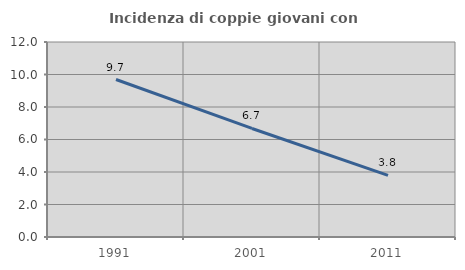
| Category | Incidenza di coppie giovani con figli |
|---|---|
| 1991.0 | 9.692 |
| 2001.0 | 6.68 |
| 2011.0 | 3.795 |